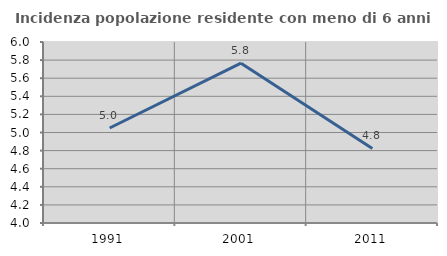
| Category | Incidenza popolazione residente con meno di 6 anni |
|---|---|
| 1991.0 | 5.05 |
| 2001.0 | 5.766 |
| 2011.0 | 4.824 |